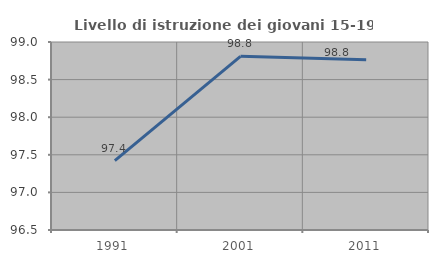
| Category | Livello di istruzione dei giovani 15-19 anni |
|---|---|
| 1991.0 | 97.423 |
| 2001.0 | 98.81 |
| 2011.0 | 98.765 |